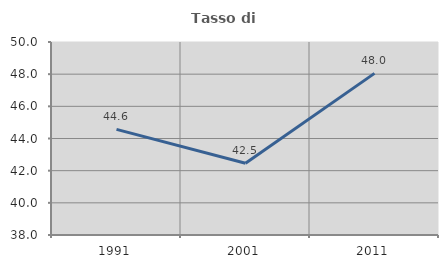
| Category | Tasso di occupazione   |
|---|---|
| 1991.0 | 44.569 |
| 2001.0 | 42.464 |
| 2011.0 | 48.05 |